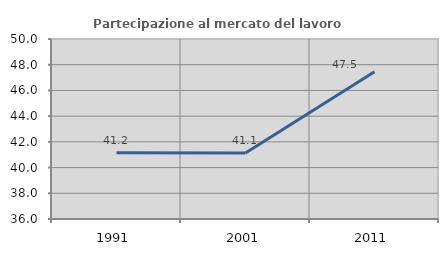
| Category | Partecipazione al mercato del lavoro  femminile |
|---|---|
| 1991.0 | 41.157 |
| 2001.0 | 41.14 |
| 2011.0 | 47.456 |